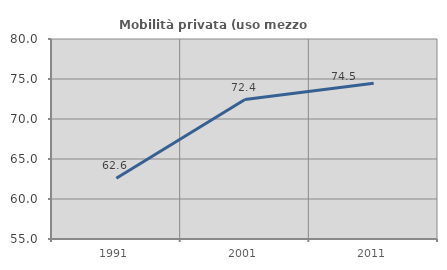
| Category | Mobilità privata (uso mezzo privato) |
|---|---|
| 1991.0 | 62.593 |
| 2001.0 | 72.427 |
| 2011.0 | 74.466 |